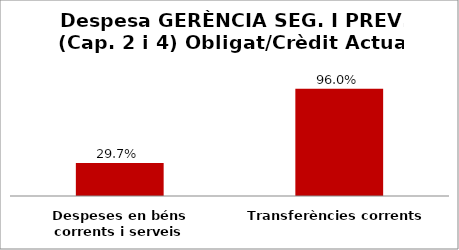
| Category | Series 0 |
|---|---|
| Despeses en béns corrents i serveis | 0.297 |
| Transferències corrents | 0.96 |